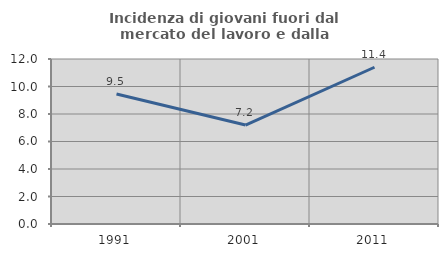
| Category | Incidenza di giovani fuori dal mercato del lavoro e dalla formazione  |
|---|---|
| 1991.0 | 9.452 |
| 2001.0 | 7.194 |
| 2011.0 | 11.4 |